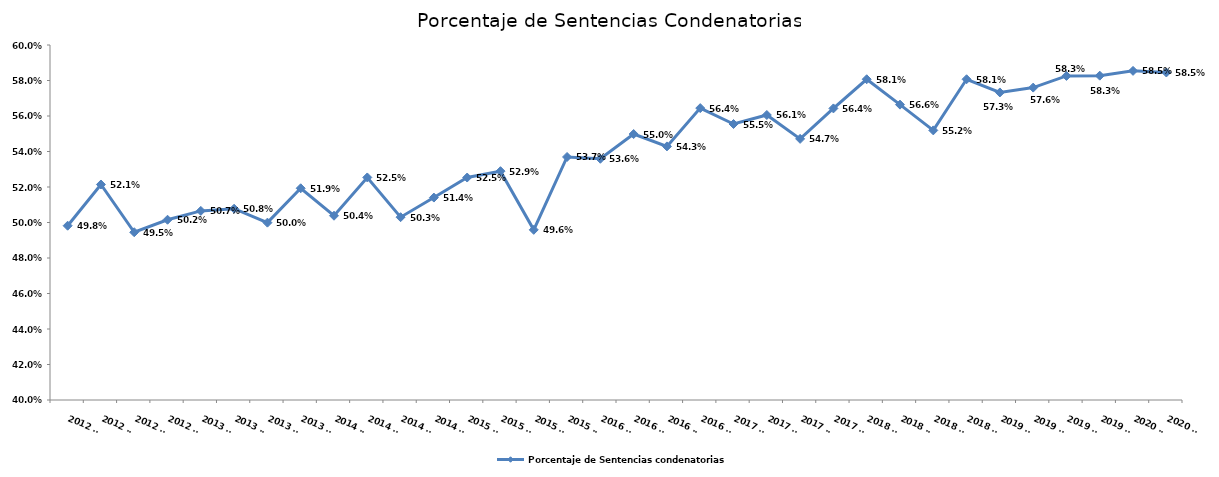
| Category | Porcentaje de Sentencias condenatorias |
|---|---|
| 2012 T1 | 0.498 |
| 2012 T2 | 0.521 |
| 2012 T3 | 0.495 |
| 2012 T4 | 0.502 |
| 2013 T1 | 0.507 |
| 2013 T2 | 0.508 |
| 2013 T3 | 0.5 |
| 2013 T4 | 0.519 |
| 2014 T1 | 0.504 |
| 2014 T2 | 0.525 |
| 2014 T3 | 0.503 |
| 2014 T4 | 0.514 |
| 2015 T1 | 0.525 |
| 2015 T2 | 0.529 |
| 2015 T3 | 0.496 |
| 2015 T4 | 0.537 |
| 2016 T1 | 0.536 |
| 2016 T2 | 0.55 |
| 2016 T3 | 0.543 |
| 2016 T4 | 0.564 |
| 2017 T1 | 0.555 |
| 2017 T2 | 0.561 |
| 2017 T3 | 0.547 |
| 2017 T4 | 0.564 |
| 2018 T1 | 0.581 |
| 2018 T2 | 0.566 |
| 2018 T3 | 0.552 |
| 2018 T4 | 0.581 |
| 2019 T1 | 0.573 |
| 2019 T2 | 0.576 |
| 2019 T3 | 0.583 |
| 2019 T4 | 0.583 |
| 2020 T1 | 0.585 |
| 2020 T2 | 0.585 |